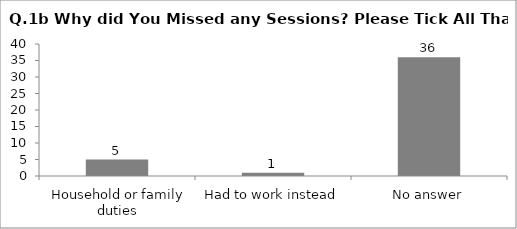
| Category | Q.1b Why did You Missed any Sessions? Please Tick All That Apply |
|---|---|
| Household or family duties | 5 |
| Had to work instead | 1 |
| No answer | 36 |